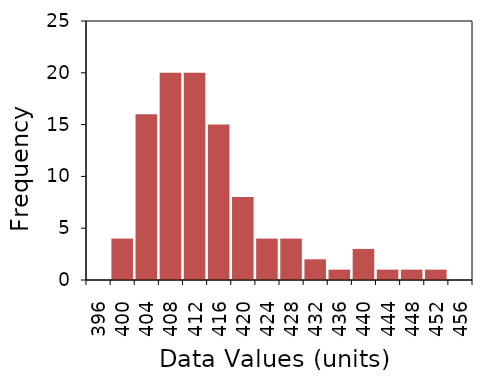
| Category | Series 1 |
|---|---|
| 396.0 | 0 |
| 400.0 | 4 |
| 404.0 | 16 |
| 408.0 | 20 |
| 412.0 | 20 |
| 416.0 | 15 |
| 420.0 | 8 |
| 424.0 | 4 |
| 428.0 | 4 |
| 432.0 | 2 |
| 436.0 | 1 |
| 440.0 | 3 |
| 444.0 | 1 |
| 448.0 | 1 |
| 452.0 | 1 |
| 456.0 | 0 |